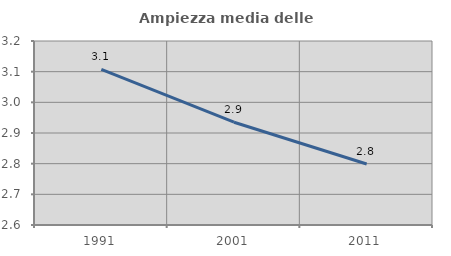
| Category | Ampiezza media delle famiglie |
|---|---|
| 1991.0 | 3.108 |
| 2001.0 | 2.935 |
| 2011.0 | 2.799 |